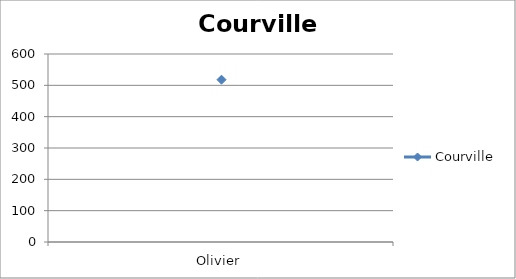
| Category | Courville |
|---|---|
| Olivier | 518 |